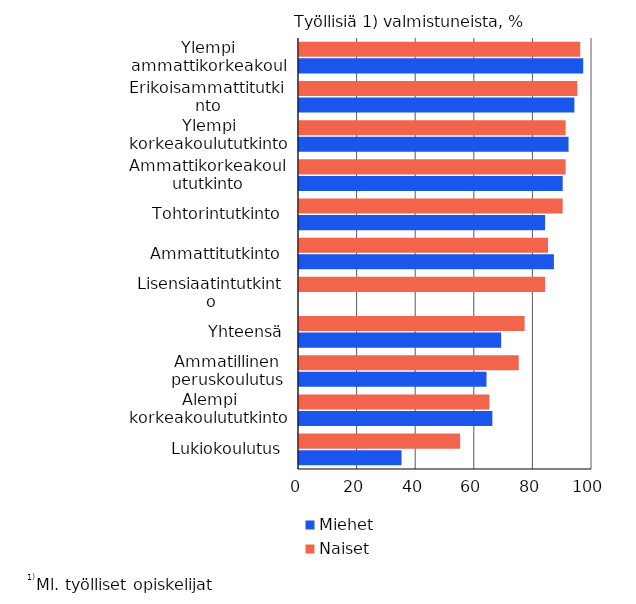
| Category | Miehet | Naiset |
|---|---|---|
| Lukiokoulutus | 35 | 55 |
| Alempi korkeakoulututkinto | 66 | 65 |
| Ammatillinen peruskoulutus | 64 | 75 |
| Yhteensä | 69 | 77 |
| Lisensiaatintutkinto | 0 | 84 |
| Ammattitutkinto | 87 | 85 |
| Tohtorintutkinto | 84 | 90 |
| Ammattikorkeakoulututkinto | 90 | 91 |
| Ylempi korkeakoulututkinto | 92 | 91 |
| Erikoisammattitutkinto | 94 | 95 |
| Ylempi ammattikorkeakoulututkinto | 97 | 96 |